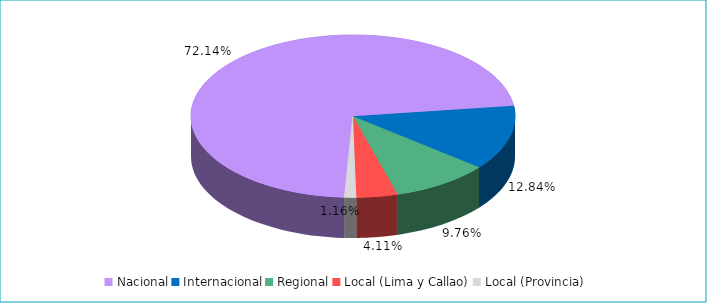
| Category | Series 0 |
|---|---|
| Nacional | 0.721 |
| Internacional | 0.128 |
| Regional | 0.098 |
| Local (Lima y Callao) | 0.041 |
| Local (Provincia) | 0.012 |